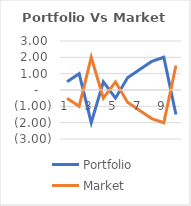
| Category | Portfolio | Market |
|---|---|---|
| 0 | 0.5 | -0.5 |
| 1 | 1 | -1 |
| 2 | -2 | 2 |
| 3 | 0.5 | -0.5 |
| 4 | -0.5 | 0.5 |
| 5 | 0.75 | -0.75 |
| 6 | 1.25 | -1.25 |
| 7 | 1.75 | -1.75 |
| 8 | 2 | -2 |
| 9 | -1.5 | 1.5 |